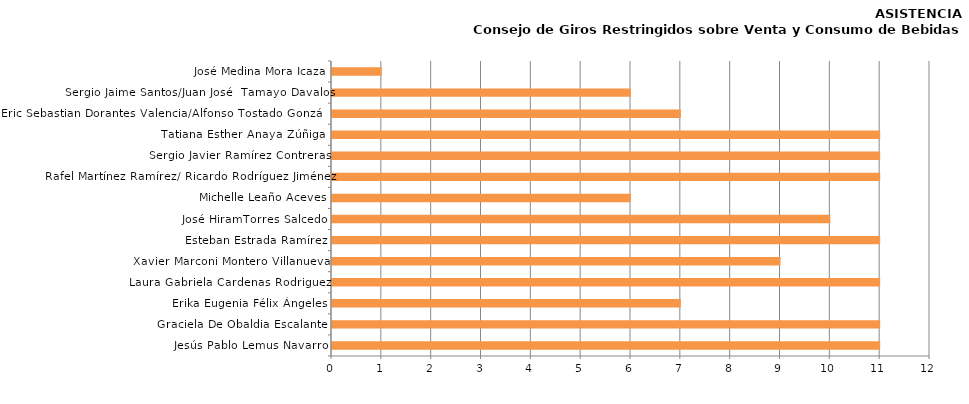
| Category | Series 0 |
|---|---|
| Jesús Pablo Lemus Navarro | 11 |
| Graciela De Obaldia Escalante | 11 |
| Erika Eugenia Félix Ángeles | 7 |
| Laura Gabriela Cardenas Rodriguez | 11 |
| Xavier Marconi Montero Villanueva | 9 |
| Esteban Estrada Ramírez | 11 |
| José HiramTorres Salcedo | 10 |
|  Michelle Leaño Aceves | 6 |
| Rafel Martínez Ramírez/ Ricardo Rodríguez Jiménez | 11 |
| Sergio Javier Ramírez Contreras | 11 |
| Tatiana Esther Anaya Zúñiga  | 11 |
| Eric Sebastian Dorantes Valencia/Alfonso Tostado González | 7 |
| Sergio Jaime Santos/Juan José  Tamayo Davalos | 6 |
| José Medina Mora Icaza | 1 |